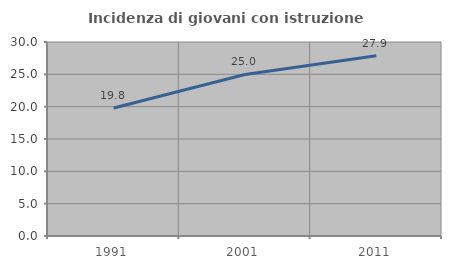
| Category | Incidenza di giovani con istruzione universitaria |
|---|---|
| 1991.0 | 19.8 |
| 2001.0 | 24.986 |
| 2011.0 | 27.869 |